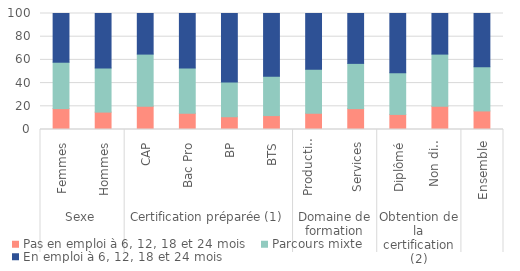
| Category | Pas en emploi à 6, 12, 18 et 24 mois | Parcours mixte | En emploi à 6, 12, 18 et 24 mois |
|---|---|---|---|
| 0 | 18 | 40 | 42 |
| 1 | 15 | 38 | 47 |
| 2 | 20 | 45 | 35 |
| 3 | 14 | 39 | 47 |
| 4 | 11 | 30 | 59 |
| 5 | 12 | 34 | 54 |
| 6 | 14 | 38 | 48 |
| 7 | 18 | 39 | 43 |
| 8 | 13 | 36 | 51 |
| 9 | 20 | 45 | 35 |
| 10 | 16 | 38 | 46 |